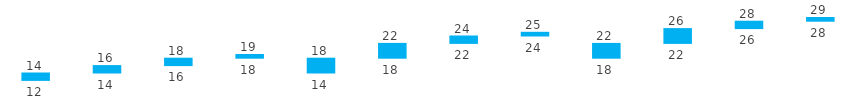
| Category | Series 0 | Series 1 | Series 2 |
|---|---|---|---|
| <2 | 12 | 2 | 14 |
| 2>&<4 | 14 | 2 | 16 |
| 4>&<10 | 16 | 2 | 18 |
| >10 | 18 | 1 | 19 |
| <2 | 14 | 4 | 18 |
| 2>&<4 | 18 | 4 | 22 |
| 4>&<10 | 22 | 2 | 24 |
| >10 | 24 | 1 | 25 |
| <2 | 18 | 4 | 22 |
| 2>&<4 | 22 | 4 | 26 |
| 4>&<10 | 26 | 2 | 28 |
| >10 | 28 | 1 | 29 |